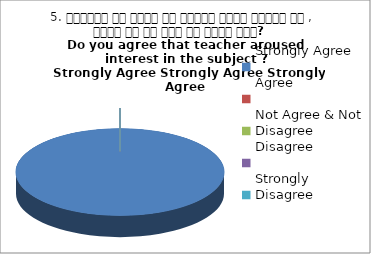
| Category | 5. शिक्षक ने विषय के प्रति रूचि जागृत की , क्या आप इस बात से सहमत हैं?  
Do you agree that teacher aroused interest in the subject ?
 Strongly Agree Strongly Agree Strongly Agree |
|---|---|
| Strongly Agree | 3 |
| Agree | 0 |
| Not Agree & Not Disagree | 0 |
| Disagree | 0 |
| Strongly Disagree | 0 |